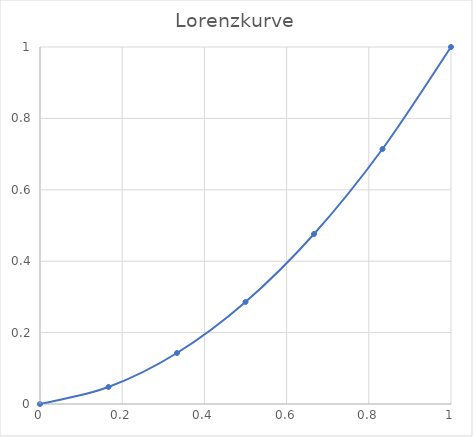
| Category | y |
|---|---|
| 0.0 | 0 |
| 0.16666666666666666 | 0.048 |
| 0.3333333333333333 | 0.143 |
| 0.5 | 0.286 |
| 0.6666666666666666 | 0.476 |
| 0.8333333333333334 | 0.714 |
| 1.0 | 1 |